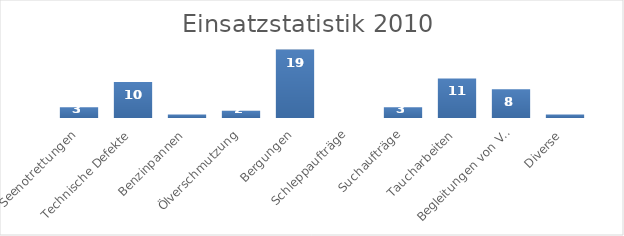
| Category | Series 0 |
|---|---|
| Seenotrettungen | 3 |
| Technische Defekte | 10 |
| Benzinpannen | 1 |
| Ölverschmutzung | 2 |
| Bergungen | 19 |
| Schleppaufträge | 0 |
| Suchaufträge | 3 |
| Taucharbeiten | 11 |
| Begleitungen von Veranstaltungen | 8 |
| Diverse | 1 |